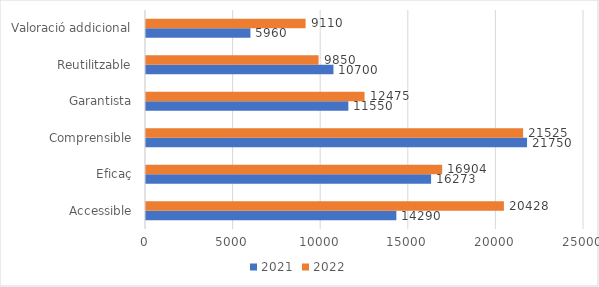
| Category | 2021 | 2022 |
|---|---|---|
| Accessible | 14290 | 20427.5 |
| Eficaç | 16272.5 | 16904 |
| Comprensible | 21750 | 21525 |
| Garantista | 11550 | 12475 |
| Reutilitzable | 10700 | 9850 |
| Valoració addicional | 5960 | 9110 |